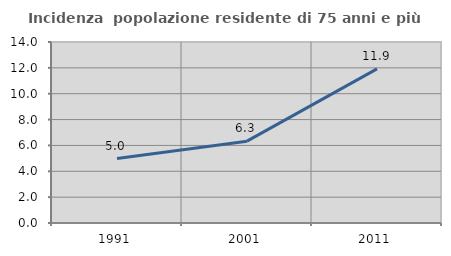
| Category | Incidenza  popolazione residente di 75 anni e più |
|---|---|
| 1991.0 | 4.986 |
| 2001.0 | 6.331 |
| 2011.0 | 11.918 |